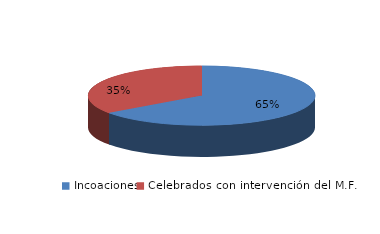
| Category | Series 0 |
|---|---|
| Incoaciones | 47436 |
| Celebrados con intervención del M.F. | 25401 |